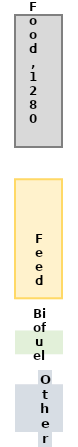
| Category | Food | Blank 1 | Feed | Blank 2 | Biofuel | Blank 3 | Other |
|---|---|---|---|---|---|---|---|
| Value | 1279.854 | 300 | 1156.905 | 300 | 217.656 | 300 | 458.746 |